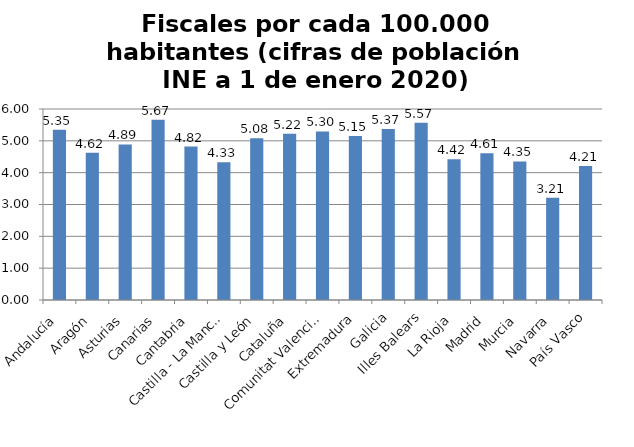
| Category | Series 0 |
|---|---|
| Andalucía | 5.346 |
| Aragón | 4.624 |
| Asturias | 4.889 |
| Canarias | 5.665 |
| Cantabria | 4.819 |
| Castilla - La Mancha | 4.329 |
| Castilla y León | 5.084 |
| Cataluña | 5.225 |
| Comunitat Valenciana | 5.296 |
| Extremadura | 5.151 |
| Galicia | 5.371 |
| Illes Balears | 5.568 |
| La Rioja | 4.419 |
| Madrid | 4.607 |
| Murcia | 4.351 |
| Navarra | 3.21 |
| País Vasco | 4.212 |